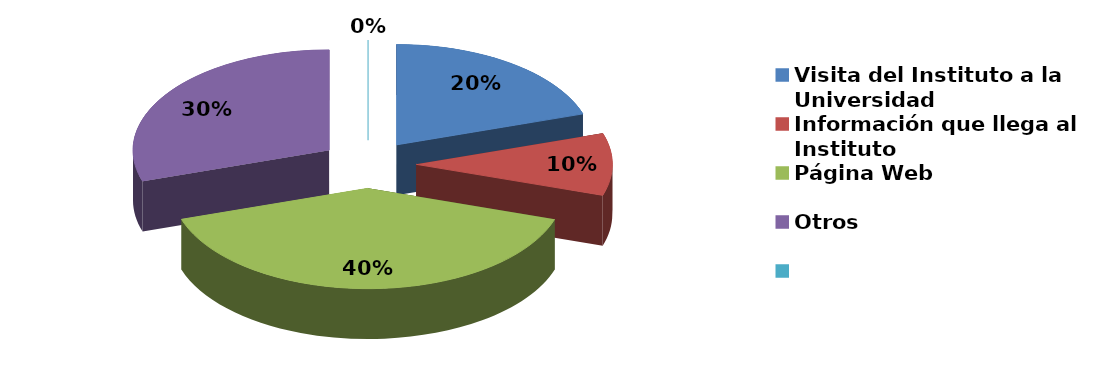
| Category | Series 0 |
|---|---|
| Visita del Instituto a la Universidad | 2 |
| Información que llega al Instituto | 1 |
| Página Web | 4 |
| Otros | 3 |